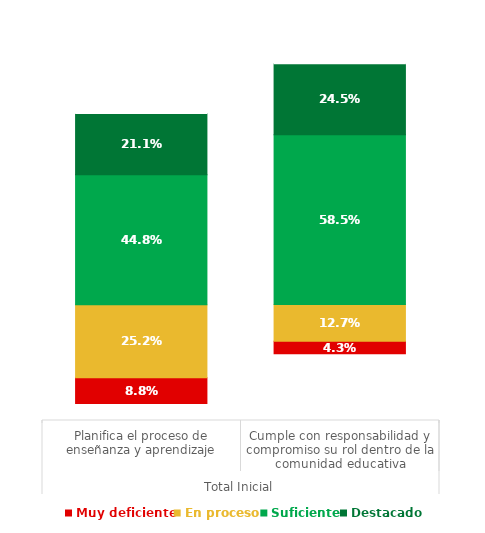
| Category | Series 0 | Muy deficiente | En proceso | Suficiente | Destacado | Series 5 |
|---|---|---|---|---|---|---|
| 0 | 0.059 | 0.088 | 0.252 | 0.448 | 0.211 | 0.341 |
| 1 | 0.23 | 0.043 | 0.127 | 0.585 | 0.245 | 0.17 |